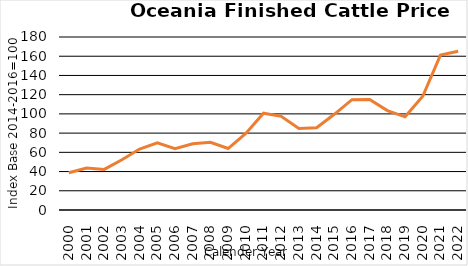
| Category | AU, NZ |
|---|---|
| 2000.0 | 38.779 |
| 2001.0 | 43.724 |
| 2002.0 | 42.224 |
| 2003.0 | 52.346 |
| 2004.0 | 63.409 |
| 2005.0 | 69.961 |
| 2006.0 | 63.871 |
| 2007.0 | 68.933 |
| 2008.0 | 70.512 |
| 2009.0 | 63.955 |
| 2010.0 | 79.667 |
| 2011.0 | 100.769 |
| 2012.0 | 97.474 |
| 2013.0 | 84.734 |
| 2014.0 | 85.641 |
| 2015.0 | 99.59 |
| 2016.0 | 114.769 |
| 2017.0 | 115.041 |
| 2018.0 | 103.41 |
| 2019.0 | 96.954 |
| 2020.0 | 118.334 |
| 2021.0 | 161.176 |
| 2022.0 | 165.128 |